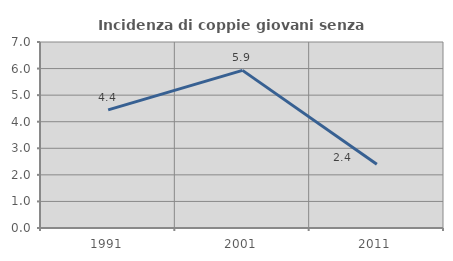
| Category | Incidenza di coppie giovani senza figli |
|---|---|
| 1991.0 | 4.444 |
| 2001.0 | 5.932 |
| 2011.0 | 2.403 |